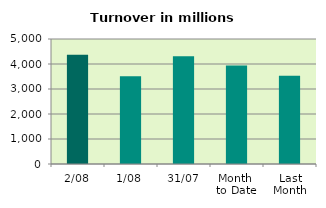
| Category | Series 0 |
|---|---|
| 2/08 | 4366.646 |
| 1/08 | 3510.596 |
| 31/07 | 4310.188 |
| Month 
to Date | 3938.621 |
| Last
Month | 3531.02 |